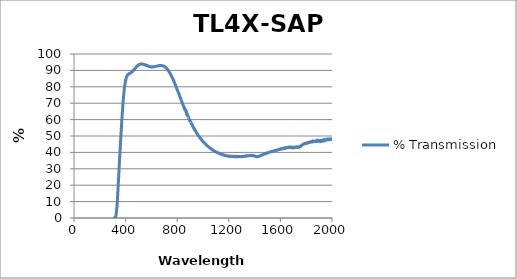
| Category | % Transmission |
|---|---|
| 2000.0 | 47.899 |
| 1999.0 | 48.148 |
| 1998.0 | 47.879 |
| 1997.0 | 48.169 |
| 1996.0 | 48.22 |
| 1995.0 | 47.907 |
| 1994.0 | 47.778 |
| 1993.0 | 48.24 |
| 1992.0 | 47.764 |
| 1991.0 | 48.165 |
| 1990.0 | 47.881 |
| 1989.0 | 47.817 |
| 1988.0 | 47.841 |
| 1987.0 | 48.096 |
| 1986.0 | 47.809 |
| 1985.0 | 48.282 |
| 1984.0 | 48.484 |
| 1983.0 | 47.778 |
| 1982.0 | 48.415 |
| 1981.0 | 48.04 |
| 1980.0 | 47.773 |
| 1979.0 | 48.169 |
| 1978.0 | 48.005 |
| 1977.0 | 47.657 |
| 1976.0 | 48.054 |
| 1975.0 | 47.846 |
| 1974.0 | 47.654 |
| 1973.0 | 48.189 |
| 1972.0 | 48.031 |
| 1971.0 | 48.069 |
| 1970.0 | 47.873 |
| 1969.0 | 47.864 |
| 1968.0 | 47.401 |
| 1967.0 | 48.026 |
| 1966.0 | 47.663 |
| 1965.0 | 47.649 |
| 1964.0 | 47.878 |
| 1963.0 | 48.008 |
| 1962.0 | 47.448 |
| 1961.0 | 47.845 |
| 1960.0 | 47.986 |
| 1959.0 | 47.753 |
| 1958.0 | 47.667 |
| 1957.0 | 47.632 |
| 1956.0 | 47.682 |
| 1955.0 | 47.975 |
| 1954.0 | 47.578 |
| 1953.0 | 47.358 |
| 1952.0 | 47.699 |
| 1951.0 | 47.663 |
| 1950.0 | 47.346 |
| 1949.0 | 47.387 |
| 1948.0 | 47.463 |
| 1947.0 | 47.564 |
| 1946.0 | 47.7 |
| 1945.0 | 47.845 |
| 1944.0 | 47.391 |
| 1943.0 | 47.65 |
| 1942.0 | 47.64 |
| 1941.0 | 46.984 |
| 1940.0 | 47.332 |
| 1939.0 | 46.998 |
| 1938.0 | 46.984 |
| 1937.0 | 47.235 |
| 1936.0 | 47.686 |
| 1935.0 | 47.364 |
| 1934.0 | 47.258 |
| 1933.0 | 47.604 |
| 1932.0 | 46.887 |
| 1931.0 | 46.625 |
| 1930.0 | 47.472 |
| 1929.0 | 47.056 |
| 1928.0 | 47.429 |
| 1927.0 | 47.47 |
| 1926.0 | 47.098 |
| 1925.0 | 47.817 |
| 1924.0 | 46.983 |
| 1923.0 | 46.737 |
| 1922.0 | 47.214 |
| 1921.0 | 47.05 |
| 1920.0 | 46.569 |
| 1919.0 | 47.263 |
| 1918.0 | 47.279 |
| 1917.0 | 46.883 |
| 1916.0 | 47.313 |
| 1915.0 | 47.316 |
| 1914.0 | 46.751 |
| 1913.0 | 47.184 |
| 1912.0 | 46.811 |
| 1911.0 | 46.47 |
| 1910.0 | 46.797 |
| 1909.0 | 46.936 |
| 1908.0 | 47.239 |
| 1907.0 | 47.198 |
| 1906.0 | 47.095 |
| 1905.0 | 46.859 |
| 1904.0 | 47.194 |
| 1903.0 | 47.221 |
| 1902.0 | 46.747 |
| 1901.0 | 47.049 |
| 1900.0 | 47.041 |
| 1899.0 | 47.037 |
| 1898.0 | 47.106 |
| 1897.0 | 47.683 |
| 1896.0 | 46.847 |
| 1895.0 | 47.118 |
| 1894.0 | 47.153 |
| 1893.0 | 46.855 |
| 1892.0 | 46.909 |
| 1891.0 | 47.131 |
| 1890.0 | 46.764 |
| 1889.0 | 47.281 |
| 1888.0 | 47.288 |
| 1887.0 | 47.15 |
| 1886.0 | 47.55 |
| 1885.0 | 47.361 |
| 1884.0 | 46.964 |
| 1883.0 | 47.193 |
| 1882.0 | 47.725 |
| 1881.0 | 47.245 |
| 1880.0 | 46.645 |
| 1879.0 | 46.89 |
| 1878.0 | 46.967 |
| 1877.0 | 47.054 |
| 1876.0 | 46.967 |
| 1875.0 | 46.882 |
| 1874.0 | 47.014 |
| 1873.0 | 47.357 |
| 1872.0 | 46.544 |
| 1871.0 | 46.437 |
| 1870.0 | 47.447 |
| 1869.0 | 47.206 |
| 1868.0 | 47.026 |
| 1867.0 | 47.107 |
| 1866.0 | 46.69 |
| 1865.0 | 46.87 |
| 1864.0 | 47.267 |
| 1863.0 | 46.69 |
| 1862.0 | 46.756 |
| 1861.0 | 46.836 |
| 1860.0 | 46.645 |
| 1859.0 | 46.829 |
| 1858.0 | 46.805 |
| 1857.0 | 46.506 |
| 1856.0 | 46.774 |
| 1855.0 | 46.83 |
| 1854.0 | 46.516 |
| 1853.0 | 46.532 |
| 1852.0 | 46.677 |
| 1851.0 | 46.577 |
| 1850.0 | 46.865 |
| 1849.0 | 46.872 |
| 1848.0 | 46.383 |
| 1847.0 | 46.395 |
| 1846.0 | 46.656 |
| 1845.0 | 46.364 |
| 1844.0 | 46.608 |
| 1843.0 | 46.667 |
| 1842.0 | 46.514 |
| 1841.0 | 46.619 |
| 1840.0 | 46.528 |
| 1839.0 | 46.42 |
| 1838.0 | 46.52 |
| 1837.0 | 46.516 |
| 1836.0 | 46.33 |
| 1835.0 | 46.42 |
| 1834.0 | 46.384 |
| 1833.0 | 46.358 |
| 1832.0 | 46.44 |
| 1831.0 | 46.318 |
| 1830.0 | 46.251 |
| 1829.0 | 46.127 |
| 1828.0 | 46.084 |
| 1827.0 | 46.01 |
| 1826.0 | 46.039 |
| 1825.0 | 46.059 |
| 1824.0 | 46.149 |
| 1823.0 | 46.27 |
| 1822.0 | 46.172 |
| 1821.0 | 45.965 |
| 1820.0 | 46.121 |
| 1819.0 | 46.095 |
| 1818.0 | 45.888 |
| 1817.0 | 45.901 |
| 1816.0 | 45.882 |
| 1815.0 | 45.861 |
| 1814.0 | 45.898 |
| 1813.0 | 45.888 |
| 1812.0 | 45.71 |
| 1811.0 | 45.816 |
| 1810.0 | 45.984 |
| 1809.0 | 45.734 |
| 1808.0 | 45.731 |
| 1807.0 | 45.812 |
| 1806.0 | 45.622 |
| 1805.0 | 45.719 |
| 1804.0 | 45.864 |
| 1803.0 | 45.72 |
| 1802.0 | 45.661 |
| 1801.0 | 45.568 |
| 1800.0 | 45.442 |
| 1799.0 | 45.663 |
| 1798.0 | 45.579 |
| 1797.0 | 45.488 |
| 1796.0 | 45.515 |
| 1795.0 | 45.496 |
| 1794.0 | 45.369 |
| 1793.0 | 45.395 |
| 1792.0 | 45.411 |
| 1791.0 | 45.245 |
| 1790.0 | 45.335 |
| 1789.0 | 45.306 |
| 1788.0 | 45.208 |
| 1787.0 | 45.273 |
| 1786.0 | 45.29 |
| 1785.0 | 45.143 |
| 1784.0 | 45.331 |
| 1783.0 | 45.303 |
| 1782.0 | 45.187 |
| 1781.0 | 45.192 |
| 1780.0 | 44.959 |
| 1779.0 | 44.929 |
| 1778.0 | 45.067 |
| 1777.0 | 45.021 |
| 1776.0 | 44.921 |
| 1775.0 | 44.785 |
| 1774.0 | 44.738 |
| 1773.0 | 44.716 |
| 1772.0 | 44.683 |
| 1771.0 | 44.55 |
| 1770.0 | 44.632 |
| 1769.0 | 44.512 |
| 1768.0 | 44.486 |
| 1767.0 | 44.313 |
| 1766.0 | 44.247 |
| 1765.0 | 44.321 |
| 1764.0 | 44.383 |
| 1763.0 | 44.117 |
| 1762.0 | 44.06 |
| 1761.0 | 43.954 |
| 1760.0 | 43.975 |
| 1759.0 | 43.83 |
| 1758.0 | 43.822 |
| 1757.0 | 43.81 |
| 1756.0 | 43.626 |
| 1755.0 | 43.666 |
| 1754.0 | 43.738 |
| 1753.0 | 43.599 |
| 1752.0 | 43.47 |
| 1751.0 | 43.351 |
| 1750.0 | 43.379 |
| 1749.0 | 43.433 |
| 1748.0 | 43.478 |
| 1747.0 | 43.389 |
| 1746.0 | 43.273 |
| 1745.0 | 43.169 |
| 1744.0 | 43.129 |
| 1743.0 | 43.326 |
| 1742.0 | 43.456 |
| 1741.0 | 43.281 |
| 1740.0 | 43.223 |
| 1739.0 | 43.194 |
| 1738.0 | 43.209 |
| 1737.0 | 43.128 |
| 1736.0 | 43.363 |
| 1735.0 | 43.258 |
| 1734.0 | 43.222 |
| 1733.0 | 43.244 |
| 1732.0 | 43.054 |
| 1731.0 | 43.08 |
| 1730.0 | 43.355 |
| 1729.0 | 43.266 |
| 1728.0 | 43.242 |
| 1727.0 | 43.366 |
| 1726.0 | 43.191 |
| 1725.0 | 43.078 |
| 1724.0 | 43.235 |
| 1723.0 | 43.092 |
| 1722.0 | 43.152 |
| 1721.0 | 43.115 |
| 1720.0 | 43.032 |
| 1719.0 | 43.144 |
| 1718.0 | 43.255 |
| 1717.0 | 43.14 |
| 1716.0 | 43.193 |
| 1715.0 | 43.084 |
| 1714.0 | 43.262 |
| 1713.0 | 43.065 |
| 1712.0 | 43.301 |
| 1711.0 | 43.218 |
| 1710.0 | 43.116 |
| 1709.0 | 42.917 |
| 1708.0 | 43.032 |
| 1707.0 | 42.933 |
| 1706.0 | 43.021 |
| 1705.0 | 42.965 |
| 1704.0 | 42.956 |
| 1703.0 | 43.086 |
| 1702.0 | 42.821 |
| 1701.0 | 42.958 |
| 1700.0 | 43.106 |
| 1699.0 | 42.881 |
| 1698.0 | 42.86 |
| 1697.0 | 42.88 |
| 1696.0 | 42.979 |
| 1695.0 | 42.654 |
| 1694.0 | 42.994 |
| 1693.0 | 43.228 |
| 1692.0 | 43.158 |
| 1691.0 | 42.959 |
| 1690.0 | 42.993 |
| 1689.0 | 42.933 |
| 1688.0 | 43.129 |
| 1687.0 | 42.91 |
| 1686.0 | 43.032 |
| 1685.0 | 43.123 |
| 1684.0 | 43 |
| 1683.0 | 42.966 |
| 1682.0 | 43.211 |
| 1681.0 | 43.147 |
| 1680.0 | 43.071 |
| 1679.0 | 43.067 |
| 1678.0 | 42.933 |
| 1677.0 | 42.947 |
| 1676.0 | 43.139 |
| 1675.0 | 43.255 |
| 1674.0 | 43.186 |
| 1673.0 | 43.284 |
| 1672.0 | 42.927 |
| 1671.0 | 42.966 |
| 1670.0 | 43.13 |
| 1669.0 | 43.098 |
| 1668.0 | 42.908 |
| 1667.0 | 43.089 |
| 1666.0 | 43.299 |
| 1665.0 | 43.008 |
| 1664.0 | 43.137 |
| 1663.0 | 43.168 |
| 1662.0 | 43.005 |
| 1661.0 | 43.088 |
| 1660.0 | 43.207 |
| 1659.0 | 43.036 |
| 1658.0 | 43.105 |
| 1657.0 | 43.16 |
| 1656.0 | 42.965 |
| 1655.0 | 43.152 |
| 1654.0 | 42.957 |
| 1653.0 | 43.078 |
| 1652.0 | 42.918 |
| 1651.0 | 43.039 |
| 1650.0 | 42.894 |
| 1649.0 | 42.882 |
| 1648.0 | 42.87 |
| 1647.0 | 42.825 |
| 1646.0 | 42.852 |
| 1645.0 | 42.932 |
| 1644.0 | 42.61 |
| 1643.0 | 42.853 |
| 1642.0 | 42.748 |
| 1641.0 | 42.733 |
| 1640.0 | 42.688 |
| 1639.0 | 42.93 |
| 1638.0 | 42.662 |
| 1637.0 | 42.724 |
| 1636.0 | 42.666 |
| 1635.0 | 42.455 |
| 1634.0 | 42.562 |
| 1633.0 | 42.582 |
| 1632.0 | 42.4 |
| 1631.0 | 42.391 |
| 1630.0 | 42.74 |
| 1629.0 | 42.446 |
| 1628.0 | 42.569 |
| 1627.0 | 42.602 |
| 1626.0 | 42.418 |
| 1625.0 | 42.442 |
| 1624.0 | 42.402 |
| 1623.0 | 42.347 |
| 1622.0 | 42.297 |
| 1621.0 | 42.494 |
| 1620.0 | 42.457 |
| 1619.0 | 42.551 |
| 1618.0 | 42.354 |
| 1617.0 | 42.095 |
| 1616.0 | 42.242 |
| 1615.0 | 42.392 |
| 1614.0 | 42.273 |
| 1613.0 | 42.332 |
| 1612.0 | 42.292 |
| 1611.0 | 42.188 |
| 1610.0 | 42.077 |
| 1609.0 | 42.262 |
| 1608.0 | 42.091 |
| 1607.0 | 42.26 |
| 1606.0 | 42.146 |
| 1605.0 | 42.108 |
| 1604.0 | 41.963 |
| 1603.0 | 42.232 |
| 1602.0 | 41.996 |
| 1601.0 | 42.177 |
| 1600.0 | 42.031 |
| 1599.0 | 42.04 |
| 1598.0 | 41.961 |
| 1597.0 | 41.905 |
| 1596.0 | 41.883 |
| 1595.0 | 41.937 |
| 1594.0 | 41.817 |
| 1593.0 | 41.777 |
| 1592.0 | 41.778 |
| 1591.0 | 41.904 |
| 1590.0 | 41.806 |
| 1589.0 | 41.78 |
| 1588.0 | 41.712 |
| 1587.0 | 41.724 |
| 1586.0 | 41.713 |
| 1585.0 | 41.663 |
| 1584.0 | 41.647 |
| 1583.0 | 41.653 |
| 1582.0 | 41.608 |
| 1581.0 | 41.532 |
| 1580.0 | 41.485 |
| 1579.0 | 41.573 |
| 1578.0 | 41.474 |
| 1577.0 | 41.474 |
| 1576.0 | 41.538 |
| 1575.0 | 41.434 |
| 1574.0 | 41.293 |
| 1573.0 | 41.455 |
| 1572.0 | 41.416 |
| 1571.0 | 41.407 |
| 1570.0 | 41.342 |
| 1569.0 | 41.242 |
| 1568.0 | 41.216 |
| 1567.0 | 41.299 |
| 1566.0 | 41.129 |
| 1565.0 | 41.336 |
| 1564.0 | 41.243 |
| 1563.0 | 41.109 |
| 1562.0 | 41.112 |
| 1561.0 | 41.117 |
| 1560.0 | 40.992 |
| 1559.0 | 41.123 |
| 1558.0 | 41.115 |
| 1557.0 | 41.127 |
| 1556.0 | 41.09 |
| 1555.0 | 41.039 |
| 1554.0 | 40.935 |
| 1553.0 | 40.968 |
| 1552.0 | 40.93 |
| 1551.0 | 40.888 |
| 1550.0 | 40.982 |
| 1549.0 | 40.853 |
| 1548.0 | 40.654 |
| 1547.0 | 40.883 |
| 1546.0 | 40.917 |
| 1545.0 | 40.726 |
| 1544.0 | 40.822 |
| 1543.0 | 40.787 |
| 1542.0 | 40.736 |
| 1541.0 | 40.75 |
| 1540.0 | 40.683 |
| 1539.0 | 40.617 |
| 1538.0 | 40.704 |
| 1537.0 | 40.638 |
| 1536.0 | 40.569 |
| 1535.0 | 40.587 |
| 1534.0 | 40.558 |
| 1533.0 | 40.539 |
| 1532.0 | 40.547 |
| 1531.0 | 40.449 |
| 1530.0 | 40.49 |
| 1529.0 | 40.469 |
| 1528.0 | 40.363 |
| 1527.0 | 40.458 |
| 1526.0 | 40.483 |
| 1525.0 | 40.367 |
| 1524.0 | 40.31 |
| 1523.0 | 40.336 |
| 1522.0 | 40.296 |
| 1521.0 | 40.315 |
| 1520.0 | 40.295 |
| 1519.0 | 40.173 |
| 1518.0 | 40.172 |
| 1517.0 | 40.164 |
| 1516.0 | 40.163 |
| 1515.0 | 40.127 |
| 1514.0 | 40.055 |
| 1513.0 | 39.974 |
| 1512.0 | 40.031 |
| 1511.0 | 40.033 |
| 1510.0 | 39.875 |
| 1509.0 | 39.882 |
| 1508.0 | 39.959 |
| 1507.0 | 39.897 |
| 1506.0 | 39.792 |
| 1505.0 | 39.849 |
| 1504.0 | 39.826 |
| 1503.0 | 39.73 |
| 1502.0 | 39.711 |
| 1501.0 | 39.756 |
| 1500.0 | 39.638 |
| 1499.0 | 39.603 |
| 1498.0 | 39.635 |
| 1497.0 | 39.547 |
| 1496.0 | 39.581 |
| 1495.0 | 39.628 |
| 1494.0 | 39.559 |
| 1493.0 | 39.537 |
| 1492.0 | 39.468 |
| 1491.0 | 39.481 |
| 1490.0 | 39.488 |
| 1489.0 | 39.483 |
| 1488.0 | 39.36 |
| 1487.0 | 39.338 |
| 1486.0 | 39.259 |
| 1485.0 | 39.25 |
| 1484.0 | 39.317 |
| 1483.0 | 39.297 |
| 1482.0 | 39.196 |
| 1481.0 | 39.184 |
| 1480.0 | 39.09 |
| 1479.0 | 39.095 |
| 1478.0 | 39.167 |
| 1477.0 | 39.063 |
| 1476.0 | 38.978 |
| 1475.0 | 39.027 |
| 1474.0 | 39.024 |
| 1473.0 | 38.956 |
| 1472.0 | 38.945 |
| 1471.0 | 38.904 |
| 1470.0 | 38.805 |
| 1469.0 | 38.796 |
| 1468.0 | 38.779 |
| 1467.0 | 38.715 |
| 1466.0 | 38.665 |
| 1465.0 | 38.651 |
| 1464.0 | 38.641 |
| 1463.0 | 38.597 |
| 1462.0 | 38.51 |
| 1461.0 | 38.428 |
| 1460.0 | 38.515 |
| 1459.0 | 38.494 |
| 1458.0 | 38.413 |
| 1457.0 | 38.379 |
| 1456.0 | 38.311 |
| 1455.0 | 38.321 |
| 1454.0 | 38.347 |
| 1453.0 | 38.293 |
| 1452.0 | 38.188 |
| 1451.0 | 38.182 |
| 1450.0 | 38.185 |
| 1449.0 | 38.187 |
| 1448.0 | 38.183 |
| 1447.0 | 38.138 |
| 1446.0 | 38.05 |
| 1445.0 | 37.999 |
| 1444.0 | 37.927 |
| 1443.0 | 37.873 |
| 1442.0 | 37.922 |
| 1441.0 | 37.865 |
| 1440.0 | 37.735 |
| 1439.0 | 37.735 |
| 1438.0 | 37.739 |
| 1437.0 | 37.763 |
| 1436.0 | 37.764 |
| 1435.0 | 37.607 |
| 1434.0 | 37.549 |
| 1433.0 | 37.596 |
| 1432.0 | 37.525 |
| 1431.0 | 37.514 |
| 1430.0 | 37.501 |
| 1429.0 | 37.499 |
| 1428.0 | 37.447 |
| 1427.0 | 37.434 |
| 1426.0 | 37.42 |
| 1425.0 | 37.395 |
| 1424.0 | 37.459 |
| 1423.0 | 37.405 |
| 1422.0 | 37.389 |
| 1421.0 | 37.432 |
| 1420.0 | 37.395 |
| 1419.0 | 37.357 |
| 1418.0 | 37.371 |
| 1417.0 | 37.406 |
| 1416.0 | 37.37 |
| 1415.0 | 37.377 |
| 1414.0 | 37.41 |
| 1413.0 | 37.452 |
| 1412.0 | 37.535 |
| 1411.0 | 37.556 |
| 1410.0 | 37.496 |
| 1409.0 | 37.582 |
| 1408.0 | 37.574 |
| 1407.0 | 37.581 |
| 1406.0 | 37.636 |
| 1405.0 | 37.629 |
| 1404.0 | 37.673 |
| 1403.0 | 37.713 |
| 1402.0 | 37.719 |
| 1401.0 | 37.746 |
| 1400.0 | 37.867 |
| 1399.0 | 37.857 |
| 1398.0 | 37.848 |
| 1397.0 | 37.937 |
| 1396.0 | 37.902 |
| 1395.0 | 37.892 |
| 1394.0 | 37.936 |
| 1393.0 | 37.878 |
| 1392.0 | 37.907 |
| 1391.0 | 38.05 |
| 1390.0 | 38.023 |
| 1389.0 | 38.096 |
| 1388.0 | 38.09 |
| 1387.0 | 38.023 |
| 1386.0 | 37.978 |
| 1385.0 | 38.109 |
| 1384.0 | 38.074 |
| 1383.0 | 38.005 |
| 1382.0 | 38.123 |
| 1381.0 | 38.086 |
| 1380.0 | 38.11 |
| 1379.0 | 38.124 |
| 1378.0 | 38.104 |
| 1377.0 | 38.168 |
| 1376.0 | 38.157 |
| 1375.0 | 38.091 |
| 1374.0 | 38.033 |
| 1373.0 | 38.13 |
| 1372.0 | 38.113 |
| 1371.0 | 38.154 |
| 1370.0 | 38.108 |
| 1369.0 | 37.96 |
| 1368.0 | 38.064 |
| 1367.0 | 38.095 |
| 1366.0 | 38.017 |
| 1365.0 | 38.129 |
| 1364.0 | 38.044 |
| 1363.0 | 37.963 |
| 1362.0 | 37.989 |
| 1361.0 | 38.101 |
| 1360.0 | 38.033 |
| 1359.0 | 38.062 |
| 1358.0 | 37.998 |
| 1357.0 | 37.927 |
| 1356.0 | 37.943 |
| 1355.0 | 38.027 |
| 1354.0 | 38.003 |
| 1353.0 | 38.015 |
| 1352.0 | 37.988 |
| 1351.0 | 37.906 |
| 1350.0 | 37.901 |
| 1349.0 | 37.92 |
| 1348.0 | 37.947 |
| 1347.0 | 37.992 |
| 1346.0 | 37.937 |
| 1345.0 | 37.817 |
| 1344.0 | 37.836 |
| 1343.0 | 37.927 |
| 1342.0 | 37.871 |
| 1341.0 | 37.836 |
| 1340.0 | 37.885 |
| 1339.0 | 37.799 |
| 1338.0 | 37.934 |
| 1337.0 | 38.11 |
| 1336.0 | 38.055 |
| 1335.0 | 37.761 |
| 1334.0 | 37.706 |
| 1333.0 | 37.616 |
| 1332.0 | 37.587 |
| 1331.0 | 37.607 |
| 1330.0 | 37.628 |
| 1329.0 | 37.733 |
| 1328.0 | 37.623 |
| 1327.0 | 37.639 |
| 1326.0 | 37.653 |
| 1325.0 | 37.591 |
| 1324.0 | 37.609 |
| 1323.0 | 37.588 |
| 1322.0 | 37.585 |
| 1321.0 | 37.508 |
| 1320.0 | 37.43 |
| 1319.0 | 37.507 |
| 1318.0 | 37.534 |
| 1317.0 | 37.649 |
| 1316.0 | 37.649 |
| 1315.0 | 37.634 |
| 1314.0 | 37.643 |
| 1313.0 | 37.604 |
| 1312.0 | 37.633 |
| 1311.0 | 37.489 |
| 1310.0 | 37.45 |
| 1309.0 | 37.423 |
| 1308.0 | 37.584 |
| 1307.0 | 37.608 |
| 1306.0 | 37.613 |
| 1305.0 | 37.648 |
| 1304.0 | 37.592 |
| 1303.0 | 37.541 |
| 1302.0 | 37.503 |
| 1301.0 | 37.434 |
| 1300.0 | 37.381 |
| 1299.0 | 37.493 |
| 1298.0 | 37.438 |
| 1297.0 | 37.36 |
| 1296.0 | 37.457 |
| 1295.0 | 37.515 |
| 1294.0 | 37.416 |
| 1293.0 | 37.476 |
| 1292.0 | 37.553 |
| 1291.0 | 37.484 |
| 1290.0 | 37.44 |
| 1289.0 | 37.507 |
| 1288.0 | 37.447 |
| 1287.0 | 37.48 |
| 1286.0 | 37.547 |
| 1285.0 | 37.5 |
| 1284.0 | 37.535 |
| 1283.0 | 37.566 |
| 1282.0 | 37.541 |
| 1281.0 | 37.474 |
| 1280.0 | 37.523 |
| 1279.0 | 37.522 |
| 1278.0 | 37.414 |
| 1277.0 | 37.46 |
| 1276.0 | 37.396 |
| 1275.0 | 37.441 |
| 1274.0 | 37.479 |
| 1273.0 | 37.42 |
| 1272.0 | 37.421 |
| 1271.0 | 37.505 |
| 1270.0 | 37.421 |
| 1269.0 | 37.422 |
| 1268.0 | 37.529 |
| 1267.0 | 37.422 |
| 1266.0 | 37.498 |
| 1265.0 | 37.34 |
| 1264.0 | 37.314 |
| 1263.0 | 37.533 |
| 1262.0 | 37.495 |
| 1261.0 | 37.473 |
| 1260.0 | 37.354 |
| 1259.0 | 37.469 |
| 1258.0 | 37.332 |
| 1257.0 | 37.368 |
| 1256.0 | 37.51 |
| 1255.0 | 37.538 |
| 1254.0 | 37.541 |
| 1253.0 | 37.456 |
| 1252.0 | 37.389 |
| 1251.0 | 37.45 |
| 1250.0 | 37.481 |
| 1249.0 | 37.391 |
| 1248.0 | 37.473 |
| 1247.0 | 37.542 |
| 1246.0 | 37.427 |
| 1245.0 | 37.417 |
| 1244.0 | 37.539 |
| 1243.0 | 37.358 |
| 1242.0 | 37.566 |
| 1241.0 | 37.45 |
| 1240.0 | 37.382 |
| 1239.0 | 37.49 |
| 1238.0 | 37.548 |
| 1237.0 | 37.434 |
| 1236.0 | 37.457 |
| 1235.0 | 37.558 |
| 1234.0 | 37.508 |
| 1233.0 | 37.472 |
| 1232.0 | 37.537 |
| 1231.0 | 37.593 |
| 1230.0 | 37.56 |
| 1229.0 | 37.546 |
| 1228.0 | 37.618 |
| 1227.0 | 37.518 |
| 1226.0 | 37.543 |
| 1225.0 | 37.484 |
| 1224.0 | 37.572 |
| 1223.0 | 37.5 |
| 1222.0 | 37.478 |
| 1221.0 | 37.45 |
| 1220.0 | 37.511 |
| 1219.0 | 37.452 |
| 1218.0 | 37.55 |
| 1217.0 | 37.69 |
| 1216.0 | 37.608 |
| 1215.0 | 37.723 |
| 1214.0 | 37.692 |
| 1213.0 | 37.618 |
| 1212.0 | 37.609 |
| 1211.0 | 37.625 |
| 1210.0 | 37.551 |
| 1209.0 | 37.587 |
| 1208.0 | 37.453 |
| 1207.0 | 37.459 |
| 1206.0 | 37.618 |
| 1205.0 | 37.7 |
| 1204.0 | 37.776 |
| 1203.0 | 37.711 |
| 1202.0 | 37.727 |
| 1201.0 | 37.582 |
| 1200.0 | 37.563 |
| 1199.0 | 37.684 |
| 1198.0 | 37.719 |
| 1197.0 | 37.811 |
| 1196.0 | 37.809 |
| 1195.0 | 37.733 |
| 1194.0 | 37.813 |
| 1193.0 | 37.768 |
| 1192.0 | 37.777 |
| 1191.0 | 37.823 |
| 1190.0 | 37.883 |
| 1189.0 | 37.778 |
| 1188.0 | 37.784 |
| 1187.0 | 37.874 |
| 1186.0 | 37.904 |
| 1185.0 | 37.829 |
| 1184.0 | 37.828 |
| 1183.0 | 37.913 |
| 1182.0 | 37.849 |
| 1181.0 | 37.913 |
| 1180.0 | 37.968 |
| 1179.0 | 38.028 |
| 1178.0 | 37.966 |
| 1177.0 | 38.087 |
| 1176.0 | 38.053 |
| 1175.0 | 38.024 |
| 1174.0 | 38.091 |
| 1173.0 | 38.049 |
| 1172.0 | 38.166 |
| 1171.0 | 38.246 |
| 1170.0 | 38.109 |
| 1169.0 | 38.139 |
| 1168.0 | 38.108 |
| 1167.0 | 38.091 |
| 1166.0 | 38.221 |
| 1165.0 | 38.194 |
| 1164.0 | 38.216 |
| 1163.0 | 38.339 |
| 1162.0 | 38.454 |
| 1161.0 | 38.443 |
| 1160.0 | 38.5 |
| 1159.0 | 38.522 |
| 1158.0 | 38.429 |
| 1157.0 | 38.523 |
| 1156.0 | 38.573 |
| 1155.0 | 38.447 |
| 1154.0 | 38.468 |
| 1153.0 | 38.488 |
| 1152.0 | 38.519 |
| 1151.0 | 38.649 |
| 1150.0 | 38.705 |
| 1149.0 | 38.74 |
| 1148.0 | 38.815 |
| 1147.0 | 38.779 |
| 1146.0 | 38.746 |
| 1145.0 | 38.811 |
| 1144.0 | 38.826 |
| 1143.0 | 38.821 |
| 1142.0 | 38.837 |
| 1141.0 | 38.843 |
| 1140.0 | 38.802 |
| 1139.0 | 38.942 |
| 1138.0 | 39.064 |
| 1137.0 | 39.117 |
| 1136.0 | 39.169 |
| 1135.0 | 39.156 |
| 1134.0 | 39.15 |
| 1133.0 | 39.182 |
| 1132.0 | 39.243 |
| 1131.0 | 39.149 |
| 1130.0 | 39.15 |
| 1129.0 | 39.17 |
| 1128.0 | 39.219 |
| 1127.0 | 39.348 |
| 1126.0 | 39.359 |
| 1125.0 | 39.432 |
| 1124.0 | 39.576 |
| 1123.0 | 39.579 |
| 1122.0 | 39.528 |
| 1121.0 | 39.634 |
| 1120.0 | 39.643 |
| 1119.0 | 39.615 |
| 1118.0 | 39.631 |
| 1117.0 | 39.758 |
| 1116.0 | 39.725 |
| 1115.0 | 39.778 |
| 1114.0 | 39.824 |
| 1113.0 | 39.829 |
| 1112.0 | 39.89 |
| 1111.0 | 39.942 |
| 1110.0 | 39.993 |
| 1109.0 | 39.988 |
| 1108.0 | 39.992 |
| 1107.0 | 40.024 |
| 1106.0 | 40.134 |
| 1105.0 | 40.162 |
| 1104.0 | 40.126 |
| 1103.0 | 40.227 |
| 1102.0 | 40.273 |
| 1101.0 | 40.263 |
| 1100.0 | 40.314 |
| 1099.0 | 40.369 |
| 1098.0 | 40.392 |
| 1097.0 | 40.426 |
| 1096.0 | 40.433 |
| 1095.0 | 40.421 |
| 1094.0 | 40.57 |
| 1093.0 | 40.675 |
| 1092.0 | 40.665 |
| 1091.0 | 40.699 |
| 1090.0 | 40.755 |
| 1089.0 | 40.753 |
| 1088.0 | 40.739 |
| 1087.0 | 40.82 |
| 1086.0 | 40.941 |
| 1085.0 | 41.015 |
| 1084.0 | 41.08 |
| 1083.0 | 41.07 |
| 1082.0 | 41.145 |
| 1081.0 | 41.192 |
| 1080.0 | 41.174 |
| 1079.0 | 41.258 |
| 1078.0 | 41.314 |
| 1077.0 | 41.424 |
| 1076.0 | 41.519 |
| 1075.0 | 41.487 |
| 1074.0 | 41.523 |
| 1073.0 | 41.588 |
| 1072.0 | 41.669 |
| 1071.0 | 41.737 |
| 1070.0 | 41.707 |
| 1069.0 | 41.728 |
| 1068.0 | 41.876 |
| 1067.0 | 41.97 |
| 1066.0 | 42.034 |
| 1065.0 | 42.084 |
| 1064.0 | 42.116 |
| 1063.0 | 42.188 |
| 1062.0 | 42.273 |
| 1061.0 | 42.331 |
| 1060.0 | 42.406 |
| 1059.0 | 42.432 |
| 1058.0 | 42.494 |
| 1057.0 | 42.564 |
| 1056.0 | 42.627 |
| 1055.0 | 42.75 |
| 1054.0 | 42.774 |
| 1053.0 | 42.763 |
| 1052.0 | 42.841 |
| 1051.0 | 42.889 |
| 1050.0 | 42.934 |
| 1049.0 | 43.035 |
| 1048.0 | 43.062 |
| 1047.0 | 43.096 |
| 1046.0 | 43.209 |
| 1045.0 | 43.233 |
| 1044.0 | 43.269 |
| 1043.0 | 43.417 |
| 1042.0 | 43.479 |
| 1041.0 | 43.501 |
| 1040.0 | 43.641 |
| 1039.0 | 43.673 |
| 1038.0 | 43.686 |
| 1037.0 | 43.783 |
| 1036.0 | 43.892 |
| 1035.0 | 43.956 |
| 1034.0 | 44.004 |
| 1033.0 | 44.019 |
| 1032.0 | 44.084 |
| 1031.0 | 44.246 |
| 1030.0 | 44.321 |
| 1029.0 | 44.342 |
| 1028.0 | 44.477 |
| 1027.0 | 44.502 |
| 1026.0 | 44.5 |
| 1025.0 | 44.613 |
| 1024.0 | 44.757 |
| 1023.0 | 44.853 |
| 1022.0 | 44.968 |
| 1021.0 | 44.927 |
| 1020.0 | 44.979 |
| 1019.0 | 45.151 |
| 1018.0 | 45.228 |
| 1017.0 | 45.253 |
| 1016.0 | 45.365 |
| 1015.0 | 45.38 |
| 1014.0 | 45.406 |
| 1013.0 | 45.554 |
| 1012.0 | 45.606 |
| 1011.0 | 45.692 |
| 1010.0 | 45.865 |
| 1009.0 | 45.978 |
| 1008.0 | 45.961 |
| 1007.0 | 46.102 |
| 1006.0 | 46.165 |
| 1005.0 | 46.253 |
| 1004.0 | 46.353 |
| 1003.0 | 46.426 |
| 1002.0 | 46.363 |
| 1001.0 | 46.508 |
| 1000.0 | 46.695 |
| 999.0 | 46.75 |
| 998.0 | 46.92 |
| 997.0 | 46.937 |
| 996.0 | 46.948 |
| 995.0 | 47.136 |
| 994.0 | 47.261 |
| 993.0 | 47.357 |
| 992.0 | 47.471 |
| 991.0 | 47.53 |
| 990.0 | 47.499 |
| 989.0 | 47.624 |
| 988.0 | 47.736 |
| 987.0 | 47.852 |
| 986.0 | 47.989 |
| 985.0 | 48.058 |
| 984.0 | 48.108 |
| 983.0 | 48.338 |
| 982.0 | 48.432 |
| 981.0 | 48.468 |
| 980.0 | 48.765 |
| 979.0 | 48.615 |
| 978.0 | 48.676 |
| 977.0 | 48.889 |
| 976.0 | 48.946 |
| 975.0 | 49.127 |
| 974.0 | 49.271 |
| 973.0 | 49.259 |
| 972.0 | 49.318 |
| 971.0 | 49.622 |
| 970.0 | 49.611 |
| 969.0 | 49.688 |
| 968.0 | 49.931 |
| 967.0 | 49.937 |
| 966.0 | 49.971 |
| 965.0 | 50.261 |
| 964.0 | 50.292 |
| 963.0 | 50.318 |
| 962.0 | 50.61 |
| 961.0 | 50.65 |
| 960.0 | 50.759 |
| 959.0 | 50.947 |
| 958.0 | 50.929 |
| 957.0 | 51.018 |
| 956.0 | 51.375 |
| 955.0 | 51.426 |
| 954.0 | 51.396 |
| 953.0 | 51.741 |
| 952.0 | 51.841 |
| 951.0 | 51.69 |
| 950.0 | 52.07 |
| 949.0 | 52.248 |
| 948.0 | 52.393 |
| 947.0 | 52.52 |
| 946.0 | 52.518 |
| 945.0 | 52.63 |
| 944.0 | 53.123 |
| 943.0 | 52.861 |
| 942.0 | 53.05 |
| 941.0 | 53.095 |
| 940.0 | 53.323 |
| 939.0 | 53.309 |
| 938.0 | 53.676 |
| 937.0 | 53.596 |
| 936.0 | 53.79 |
| 935.0 | 53.974 |
| 934.0 | 53.96 |
| 933.0 | 54.06 |
| 932.0 | 54.502 |
| 931.0 | 54.307 |
| 930.0 | 54.766 |
| 929.0 | 54.735 |
| 928.0 | 54.856 |
| 927.0 | 55.104 |
| 926.0 | 55.31 |
| 925.0 | 55.269 |
| 924.0 | 55.24 |
| 923.0 | 55.763 |
| 922.0 | 55.813 |
| 921.0 | 55.959 |
| 920.0 | 56.416 |
| 919.0 | 56.061 |
| 918.0 | 56.361 |
| 917.0 | 56.471 |
| 916.0 | 57.038 |
| 915.0 | 56.999 |
| 914.0 | 56.994 |
| 913.0 | 56.93 |
| 912.0 | 57.331 |
| 911.0 | 57.561 |
| 910.0 | 57.555 |
| 909.0 | 57.591 |
| 908.0 | 57.945 |
| 907.0 | 57.752 |
| 906.0 | 58.323 |
| 905.0 | 58.32 |
| 904.0 | 58.555 |
| 903.0 | 58.763 |
| 902.0 | 58.934 |
| 901.0 | 58.448 |
| 900.0 | 59.203 |
| 899.0 | 59.46 |
| 898.0 | 59.187 |
| 897.0 | 59.747 |
| 896.0 | 59.988 |
| 895.0 | 59.738 |
| 894.0 | 59.76 |
| 893.0 | 60.257 |
| 892.0 | 60.428 |
| 891.0 | 60.633 |
| 890.0 | 61.085 |
| 889.0 | 60.946 |
| 888.0 | 60.98 |
| 887.0 | 61.362 |
| 886.0 | 61.694 |
| 885.0 | 61.384 |
| 884.0 | 62.103 |
| 883.0 | 62.295 |
| 882.0 | 61.949 |
| 881.0 | 62.592 |
| 880.0 | 62.704 |
| 879.0 | 63.282 |
| 878.0 | 62.957 |
| 877.0 | 63.553 |
| 876.0 | 62.519 |
| 875.0 | 63.616 |
| 874.0 | 64.372 |
| 873.0 | 63.672 |
| 872.0 | 64.131 |
| 871.0 | 64.409 |
| 870.0 | 64.089 |
| 869.0 | 65.536 |
| 868.0 | 64.872 |
| 867.0 | 65.297 |
| 866.0 | 65.825 |
| 865.0 | 66.031 |
| 864.0 | 65.273 |
| 863.0 | 66.164 |
| 862.0 | 66.334 |
| 861.0 | 65.644 |
| 860.0 | 66.446 |
| 859.0 | 66.467 |
| 858.0 | 66.849 |
| 857.0 | 66.628 |
| 856.0 | 66.889 |
| 855.0 | 66.899 |
| 854.0 | 67.229 |
| 853.0 | 67.197 |
| 852.0 | 67.813 |
| 851.0 | 67.904 |
| 850.0 | 68.13 |
| 849.0 | 68.248 |
| 848.0 | 68.29 |
| 847.0 | 68.713 |
| 846.0 | 69.005 |
| 845.0 | 68.833 |
| 844.0 | 69.322 |
| 843.0 | 69.391 |
| 842.0 | 69.501 |
| 841.0 | 70.006 |
| 840.0 | 69.921 |
| 839.0 | 70.371 |
| 838.0 | 70.725 |
| 837.0 | 70.609 |
| 836.0 | 70.771 |
| 835.0 | 71.008 |
| 834.0 | 71.429 |
| 833.0 | 71.527 |
| 832.0 | 71.769 |
| 831.0 | 71.802 |
| 830.0 | 72.271 |
| 829.0 | 72.359 |
| 828.0 | 72.506 |
| 827.0 | 72.702 |
| 826.0 | 72.965 |
| 825.0 | 73.206 |
| 824.0 | 73.301 |
| 823.0 | 73.655 |
| 822.0 | 73.651 |
| 821.0 | 73.723 |
| 820.0 | 74.183 |
| 819.0 | 74.382 |
| 818.0 | 74.764 |
| 817.0 | 74.868 |
| 816.0 | 75.058 |
| 815.0 | 75.201 |
| 814.0 | 75.533 |
| 813.0 | 75.82 |
| 812.0 | 75.923 |
| 811.0 | 76.141 |
| 810.0 | 76.352 |
| 809.0 | 76.419 |
| 808.0 | 76.693 |
| 807.0 | 76.883 |
| 806.0 | 76.904 |
| 805.0 | 77.118 |
| 804.0 | 77.55 |
| 803.0 | 77.764 |
| 802.0 | 77.907 |
| 801.0 | 78.189 |
| 800.0 | 78.187 |
| 799.0 | 78.445 |
| 798.0 | 78.661 |
| 797.0 | 78.989 |
| 796.0 | 79.172 |
| 795.0 | 79.29 |
| 794.0 | 79.49 |
| 793.0 | 79.666 |
| 792.0 | 79.962 |
| 791.0 | 80.11 |
| 790.0 | 80.178 |
| 789.0 | 80.441 |
| 788.0 | 80.701 |
| 787.0 | 81.036 |
| 786.0 | 81.114 |
| 785.0 | 81.321 |
| 784.0 | 81.562 |
| 783.0 | 81.732 |
| 782.0 | 81.972 |
| 781.0 | 82.144 |
| 780.0 | 82.312 |
| 779.0 | 82.425 |
| 778.0 | 82.684 |
| 777.0 | 82.884 |
| 776.0 | 83.131 |
| 775.0 | 83.248 |
| 774.0 | 83.408 |
| 773.0 | 83.618 |
| 772.0 | 83.822 |
| 771.0 | 83.953 |
| 770.0 | 84.144 |
| 769.0 | 84.396 |
| 768.0 | 84.447 |
| 767.0 | 84.658 |
| 766.0 | 84.944 |
| 765.0 | 85.161 |
| 764.0 | 85.316 |
| 763.0 | 85.508 |
| 762.0 | 85.578 |
| 761.0 | 85.677 |
| 760.0 | 85.723 |
| 759.0 | 86.037 |
| 758.0 | 86.251 |
| 757.0 | 86.35 |
| 756.0 | 86.503 |
| 755.0 | 86.639 |
| 754.0 | 86.859 |
| 753.0 | 87.1 |
| 752.0 | 87.144 |
| 751.0 | 87.264 |
| 750.0 | 87.387 |
| 749.0 | 87.506 |
| 748.0 | 87.75 |
| 747.0 | 87.903 |
| 746.0 | 88.008 |
| 745.0 | 88.131 |
| 744.0 | 88.261 |
| 743.0 | 88.521 |
| 742.0 | 88.554 |
| 741.0 | 88.628 |
| 740.0 | 88.888 |
| 739.0 | 88.995 |
| 738.0 | 89.076 |
| 737.0 | 89.182 |
| 736.0 | 89.419 |
| 735.0 | 89.588 |
| 734.0 | 89.641 |
| 733.0 | 89.656 |
| 732.0 | 89.764 |
| 731.0 | 90.011 |
| 730.0 | 90.073 |
| 729.0 | 90.092 |
| 728.0 | 90.235 |
| 727.0 | 90.39 |
| 726.0 | 90.487 |
| 725.0 | 90.6 |
| 724.0 | 90.681 |
| 723.0 | 90.768 |
| 722.0 | 90.992 |
| 721.0 | 91.073 |
| 720.0 | 91.087 |
| 719.0 | 91.159 |
| 718.0 | 91.267 |
| 717.0 | 91.289 |
| 716.0 | 91.348 |
| 715.0 | 91.377 |
| 714.0 | 91.464 |
| 713.0 | 91.652 |
| 712.0 | 91.694 |
| 711.0 | 91.763 |
| 710.0 | 91.856 |
| 709.0 | 91.925 |
| 708.0 | 92.074 |
| 707.0 | 92.106 |
| 706.0 | 92.053 |
| 705.0 | 92.097 |
| 704.0 | 92.224 |
| 703.0 | 92.231 |
| 702.0 | 92.278 |
| 701.0 | 92.302 |
| 700.0 | 92.345 |
| 699.0 | 92.494 |
| 698.0 | 92.5 |
| 697.0 | 92.475 |
| 696.0 | 92.564 |
| 695.0 | 92.588 |
| 694.0 | 92.643 |
| 693.0 | 92.754 |
| 692.0 | 92.766 |
| 691.0 | 92.784 |
| 690.0 | 92.758 |
| 689.0 | 92.794 |
| 688.0 | 92.813 |
| 687.0 | 92.784 |
| 686.0 | 92.842 |
| 685.0 | 92.913 |
| 684.0 | 92.875 |
| 683.0 | 92.889 |
| 682.0 | 92.879 |
| 681.0 | 92.874 |
| 680.0 | 92.901 |
| 679.0 | 92.905 |
| 678.0 | 92.926 |
| 677.0 | 92.988 |
| 676.0 | 93.014 |
| 675.0 | 92.984 |
| 674.0 | 92.978 |
| 673.0 | 93.005 |
| 672.0 | 93.045 |
| 671.0 | 93.013 |
| 670.0 | 93.023 |
| 669.0 | 93.009 |
| 668.0 | 92.989 |
| 667.0 | 92.92 |
| 666.0 | 92.932 |
| 665.0 | 92.975 |
| 664.0 | 92.957 |
| 663.0 | 92.958 |
| 662.0 | 92.873 |
| 661.0 | 92.848 |
| 660.0 | 92.979 |
| 659.0 | 92.973 |
| 658.0 | 92.931 |
| 657.0 | 92.896 |
| 656.0 | 92.865 |
| 655.0 | 92.825 |
| 654.0 | 92.827 |
| 653.0 | 92.761 |
| 652.0 | 92.741 |
| 651.0 | 92.783 |
| 650.0 | 92.74 |
| 649.0 | 92.713 |
| 648.0 | 92.733 |
| 647.0 | 92.719 |
| 646.0 | 92.673 |
| 645.0 | 92.664 |
| 644.0 | 92.62 |
| 643.0 | 92.606 |
| 642.0 | 92.581 |
| 641.0 | 92.509 |
| 640.0 | 92.542 |
| 639.0 | 92.612 |
| 638.0 | 92.537 |
| 637.0 | 92.481 |
| 636.0 | 92.494 |
| 635.0 | 92.5 |
| 634.0 | 92.444 |
| 633.0 | 92.415 |
| 632.0 | 92.425 |
| 631.0 | 92.359 |
| 630.0 | 92.304 |
| 629.0 | 92.377 |
| 628.0 | 92.329 |
| 627.0 | 92.289 |
| 626.0 | 92.264 |
| 625.0 | 92.32 |
| 624.0 | 92.275 |
| 623.0 | 92.299 |
| 622.0 | 92.22 |
| 621.0 | 92.179 |
| 620.0 | 92.236 |
| 619.0 | 92.235 |
| 618.0 | 92.23 |
| 617.0 | 92.176 |
| 616.0 | 92.242 |
| 615.0 | 92.224 |
| 614.0 | 92.206 |
| 613.0 | 92.186 |
| 612.0 | 92.133 |
| 611.0 | 92.172 |
| 610.0 | 92.181 |
| 609.0 | 92.208 |
| 608.0 | 92.151 |
| 607.0 | 92.128 |
| 606.0 | 92.079 |
| 605.0 | 92.142 |
| 604.0 | 92.153 |
| 603.0 | 92.185 |
| 602.0 | 92.185 |
| 601.0 | 92.187 |
| 600.0 | 92.18 |
| 599.0 | 92.099 |
| 598.0 | 92.061 |
| 597.0 | 92.097 |
| 596.0 | 92.227 |
| 595.0 | 92.228 |
| 594.0 | 92.236 |
| 593.0 | 92.294 |
| 592.0 | 92.24 |
| 591.0 | 92.164 |
| 590.0 | 92.237 |
| 589.0 | 92.309 |
| 588.0 | 92.333 |
| 587.0 | 92.272 |
| 586.0 | 92.208 |
| 585.0 | 92.288 |
| 584.0 | 92.422 |
| 583.0 | 92.426 |
| 582.0 | 92.454 |
| 581.0 | 92.425 |
| 580.0 | 92.416 |
| 579.0 | 92.449 |
| 578.0 | 92.539 |
| 577.0 | 92.501 |
| 576.0 | 92.53 |
| 575.0 | 92.569 |
| 574.0 | 92.62 |
| 573.0 | 92.768 |
| 572.0 | 92.679 |
| 571.0 | 92.746 |
| 570.0 | 92.779 |
| 569.0 | 92.802 |
| 568.0 | 92.841 |
| 567.0 | 92.816 |
| 566.0 | 92.827 |
| 565.0 | 93.017 |
| 564.0 | 93.096 |
| 563.0 | 92.937 |
| 562.0 | 93.003 |
| 561.0 | 92.999 |
| 560.0 | 92.951 |
| 559.0 | 93.037 |
| 558.0 | 93.072 |
| 557.0 | 93.146 |
| 556.0 | 93.162 |
| 555.0 | 93.197 |
| 554.0 | 93.333 |
| 553.0 | 93.269 |
| 552.0 | 93.284 |
| 551.0 | 93.342 |
| 550.0 | 93.315 |
| 549.0 | 93.366 |
| 548.0 | 93.388 |
| 547.0 | 93.468 |
| 546.0 | 93.56 |
| 545.0 | 93.579 |
| 544.0 | 93.552 |
| 543.0 | 93.589 |
| 542.0 | 93.633 |
| 541.0 | 93.708 |
| 540.0 | 93.63 |
| 539.0 | 93.709 |
| 538.0 | 93.652 |
| 537.0 | 93.712 |
| 536.0 | 93.704 |
| 535.0 | 93.723 |
| 534.0 | 93.718 |
| 533.0 | 93.864 |
| 532.0 | 93.8 |
| 531.0 | 93.778 |
| 530.0 | 93.832 |
| 529.0 | 93.929 |
| 528.0 | 93.864 |
| 527.0 | 93.837 |
| 526.0 | 93.849 |
| 525.0 | 93.836 |
| 524.0 | 93.854 |
| 523.0 | 93.883 |
| 522.0 | 93.917 |
| 521.0 | 93.825 |
| 520.0 | 93.86 |
| 519.0 | 93.92 |
| 518.0 | 93.846 |
| 517.0 | 93.866 |
| 516.0 | 93.727 |
| 515.0 | 93.831 |
| 514.0 | 93.811 |
| 513.0 | 93.8 |
| 512.0 | 93.835 |
| 511.0 | 93.815 |
| 510.0 | 93.736 |
| 509.0 | 93.722 |
| 508.0 | 93.7 |
| 507.0 | 93.607 |
| 506.0 | 93.527 |
| 505.0 | 93.549 |
| 504.0 | 93.412 |
| 503.0 | 93.397 |
| 502.0 | 93.304 |
| 501.0 | 93.374 |
| 500.0 | 93.218 |
| 499.0 | 93.27 |
| 498.0 | 93.289 |
| 497.0 | 93.141 |
| 496.0 | 93.018 |
| 495.0 | 92.953 |
| 494.0 | 92.894 |
| 493.0 | 92.897 |
| 492.0 | 92.63 |
| 491.0 | 92.714 |
| 490.0 | 92.572 |
| 489.0 | 92.414 |
| 488.0 | 92.424 |
| 487.0 | 92.485 |
| 486.0 | 92.302 |
| 485.0 | 92.215 |
| 484.0 | 92.188 |
| 483.0 | 91.914 |
| 482.0 | 91.869 |
| 481.0 | 91.955 |
| 480.0 | 91.709 |
| 479.0 | 91.621 |
| 478.0 | 91.536 |
| 477.0 | 91.404 |
| 476.0 | 91.369 |
| 475.0 | 91.368 |
| 474.0 | 91.208 |
| 473.0 | 91.125 |
| 472.0 | 91.045 |
| 471.0 | 90.991 |
| 470.0 | 90.802 |
| 469.0 | 90.796 |
| 468.0 | 90.616 |
| 467.0 | 90.567 |
| 466.0 | 90.521 |
| 465.0 | 90.486 |
| 464.0 | 90.315 |
| 463.0 | 90.292 |
| 462.0 | 90.189 |
| 461.0 | 90.052 |
| 460.0 | 89.992 |
| 459.0 | 89.847 |
| 458.0 | 89.807 |
| 457.0 | 89.741 |
| 456.0 | 89.558 |
| 455.0 | 89.44 |
| 454.0 | 89.409 |
| 453.0 | 89.266 |
| 452.0 | 89.199 |
| 451.0 | 89.274 |
| 450.0 | 89.145 |
| 449.0 | 89.027 |
| 448.0 | 88.966 |
| 447.0 | 88.876 |
| 446.0 | 88.82 |
| 445.0 | 88.759 |
| 444.0 | 88.779 |
| 443.0 | 88.757 |
| 442.0 | 88.654 |
| 441.0 | 88.644 |
| 440.0 | 88.561 |
| 439.0 | 88.507 |
| 438.0 | 88.426 |
| 437.0 | 88.321 |
| 436.0 | 88.352 |
| 435.0 | 88.279 |
| 434.0 | 88.253 |
| 433.0 | 88.157 |
| 432.0 | 88.091 |
| 431.0 | 88.118 |
| 430.0 | 88.114 |
| 429.0 | 88.096 |
| 428.0 | 87.989 |
| 427.0 | 87.954 |
| 426.0 | 87.913 |
| 425.0 | 87.905 |
| 424.0 | 87.892 |
| 423.0 | 87.772 |
| 422.0 | 87.595 |
| 421.0 | 87.66 |
| 420.0 | 87.51 |
| 419.0 | 87.534 |
| 418.0 | 87.476 |
| 417.0 | 87.379 |
| 416.0 | 87.273 |
| 415.0 | 87.139 |
| 414.0 | 87.035 |
| 413.0 | 86.935 |
| 412.0 | 86.794 |
| 411.0 | 86.536 |
| 410.0 | 86.437 |
| 409.0 | 86.257 |
| 408.0 | 85.986 |
| 407.0 | 85.814 |
| 406.0 | 85.549 |
| 405.0 | 85.453 |
| 404.0 | 85.124 |
| 403.0 | 84.854 |
| 402.0 | 84.573 |
| 401.0 | 84.122 |
| 400.0 | 83.687 |
| 399.0 | 83.313 |
| 398.0 | 82.975 |
| 397.0 | 82.568 |
| 396.0 | 82.091 |
| 395.0 | 81.605 |
| 394.0 | 81.167 |
| 393.0 | 80.465 |
| 392.0 | 80.005 |
| 391.0 | 79.368 |
| 390.0 | 78.714 |
| 389.0 | 78.04 |
| 388.0 | 77.35 |
| 387.0 | 76.554 |
| 386.0 | 75.773 |
| 385.0 | 74.946 |
| 384.0 | 74.057 |
| 383.0 | 73.178 |
| 382.0 | 72.283 |
| 381.0 | 71.295 |
| 380.0 | 70.241 |
| 379.0 | 69.205 |
| 378.0 | 68.065 |
| 377.0 | 66.777 |
| 376.0 | 65.758 |
| 375.0 | 64.762 |
| 374.0 | 63.568 |
| 373.0 | 62.212 |
| 372.0 | 61.109 |
| 371.0 | 59.892 |
| 370.0 | 58.689 |
| 369.0 | 57.381 |
| 368.0 | 56.072 |
| 367.0 | 54.828 |
| 366.0 | 53.442 |
| 365.0 | 52.003 |
| 364.0 | 50.673 |
| 363.0 | 49.45 |
| 362.0 | 48.075 |
| 361.0 | 46.71 |
| 360.0 | 45.292 |
| 359.0 | 43.792 |
| 358.0 | 42.267 |
| 357.0 | 40.866 |
| 356.0 | 39.507 |
| 355.0 | 38.121 |
| 354.0 | 36.698 |
| 353.0 | 35.294 |
| 352.0 | 33.703 |
| 351.0 | 32.216 |
| 350.0 | 30.81 |
| 349.0 | 29.213 |
| 348.0 | 27.667 |
| 347.0 | 26.178 |
| 346.0 | 24.676 |
| 345.0 | 23.175 |
| 344.0 | 21.705 |
| 343.0 | 20.216 |
| 342.0 | 18.712 |
| 341.0 | 17.253 |
| 340.0 | 15.835 |
| 339.0 | 14.435 |
| 338.0 | 13.088 |
| 337.0 | 11.792 |
| 336.0 | 10.504 |
| 335.0 | 9.245 |
| 334.0 | 8.107 |
| 333.0 | 7.057 |
| 332.0 | 6.125 |
| 331.0 | 5.236 |
| 330.0 | 4.377 |
| 329.0 | 3.599 |
| 328.0 | 2.928 |
| 327.0 | 2.339 |
| 326.0 | 1.815 |
| 325.0 | 1.425 |
| 324.0 | 1.087 |
| 323.0 | 0.79 |
| 322.0 | 0.569 |
| 321.0 | 0.419 |
| 320.0 | 0.292 |
| 319.0 | 0.195 |
| 318.0 | 0.128 |
| 317.0 | 0.064 |
| 316.0 | 0.037 |
| 315.0 | 0.01 |
| 314.0 | 0.003 |
| 313.0 | 0.022 |
| 312.0 | 0.015 |
| 311.0 | 0.016 |
| 310.0 | 0.001 |
| 309.0 | 0.01 |
| 308.0 | 0.035 |
| 307.0 | 0.043 |
| 306.0 | 0.027 |
| 305.0 | 0.011 |
| 304.0 | 0.019 |
| 303.0 | 0.019 |
| 302.0 | 0.027 |
| 301.0 | 0.011 |
| 300.0 | 0.049 |